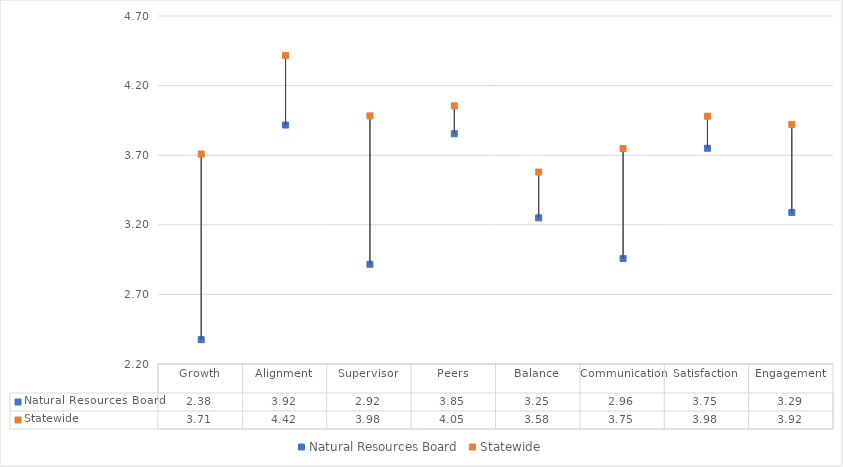
| Category | Natural Resources Board | Statewide |
|---|---|---|
| Growth | 2.375 | 3.708 |
| Alignment | 3.917 | 4.417 |
| Supervisor | 2.917 | 3.983 |
| Peers | 3.854 | 4.054 |
| Balance | 3.25 | 3.579 |
| Communication | 2.958 | 3.747 |
| Satisfaction | 3.75 | 3.98 |
| Engagement | 3.289 | 3.921 |